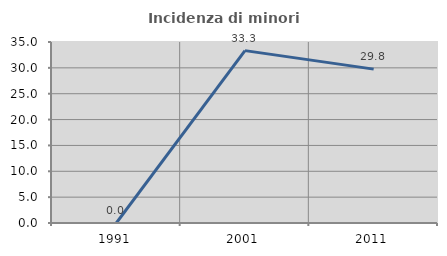
| Category | Incidenza di minori stranieri |
|---|---|
| 1991.0 | 0 |
| 2001.0 | 33.333 |
| 2011.0 | 29.756 |